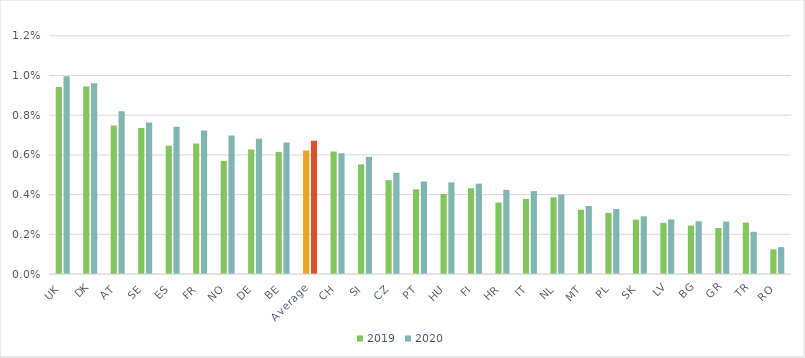
| Category | 2019 | 2020 |
|---|---|---|
| UK | 0.009 | 0.01 |
| DK | 0.009 | 0.01 |
| AT | 0.007 | 0.008 |
| SE | 0.007 | 0.008 |
| ES | 0.006 | 0.007 |
| FR | 0.007 | 0.007 |
| NO | 0.006 | 0.007 |
| DE | 0.006 | 0.007 |
| BE | 0.006 | 0.007 |
| Average | 0.006 | 0.007 |
| CH | 0.006 | 0.006 |
| SI | 0.006 | 0.006 |
| CZ | 0.005 | 0.005 |
| PT | 0.004 | 0.005 |
| HU | 0.004 | 0.005 |
| FI | 0.004 | 0.005 |
| HR | 0.004 | 0.004 |
| IT | 0.004 | 0.004 |
| NL | 0.004 | 0.004 |
| MT | 0.003 | 0.003 |
| PL | 0.003 | 0.003 |
| SK | 0.003 | 0.003 |
| LV | 0.003 | 0.003 |
| BG | 0.002 | 0.003 |
| GR | 0.002 | 0.003 |
| TR | 0.003 | 0.002 |
| RO | 0.001 | 0.001 |